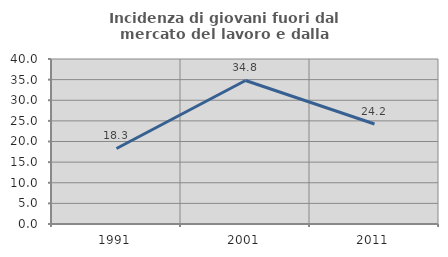
| Category | Incidenza di giovani fuori dal mercato del lavoro e dalla formazione  |
|---|---|
| 1991.0 | 18.312 |
| 2001.0 | 34.795 |
| 2011.0 | 24.234 |